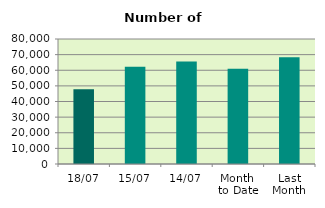
| Category | Series 0 |
|---|---|
| 18/07 | 47896 |
| 15/07 | 62188 |
| 14/07 | 65568 |
| Month 
to Date | 60999.833 |
| Last
Month | 68392.182 |